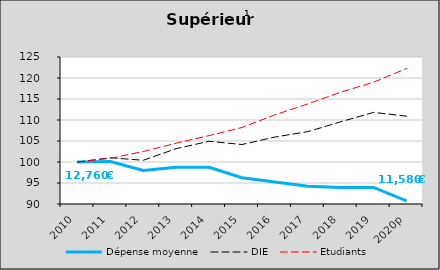
| Category | Dépense moyenne  | DIE  | Etudiants |
|---|---|---|---|
| 2010 | 100 | 100 | 100 |
| 2011 | 100.126 | 101.011 | 100.884 |
| 2012 | 97.969 | 100.409 | 102.49 |
| 2013 | 98.742 | 103.173 | 104.488 |
| 2014 | 98.728 | 104.934 | 106.287 |
| 2015 | 96.251 | 104.164 | 108.222 |
| 2016 | 95.245 | 105.944 | 111.232 |
| 2017 | 94.205 | 107.227 | 113.823 |
| 2018 | 93.956 | 109.57 | 116.619 |
| 2019 | 93.958 | 111.814 | 119.004 |
| 2020p | 90.717 | 110.908 | 122.257 |